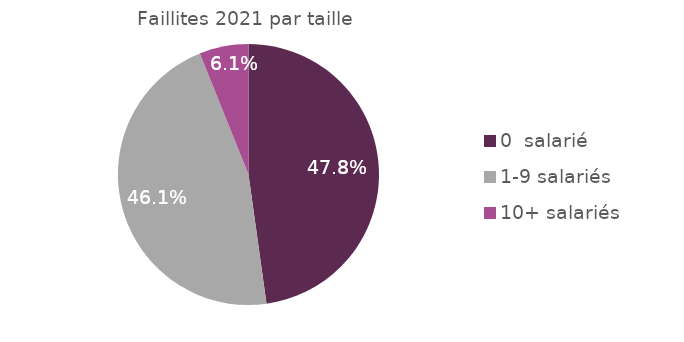
| Category | Faillites 2021 par taille |
|---|---|
| 0  salarié | 0.478 |
| 1-9 salariés | 0.461 |
| 10+ salariés | 0.061 |